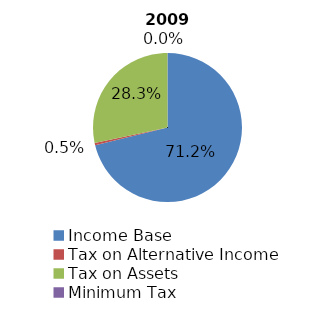
| Category | 2009 |
|---|---|
| Income Base | 523381837 |
| Tax on Alternative Income  | 3814830 |
| Tax on Assets | 208078513 |
| Minimum Tax | 106250 |